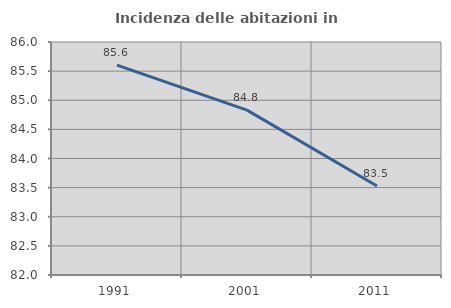
| Category | Incidenza delle abitazioni in proprietà  |
|---|---|
| 1991.0 | 85.604 |
| 2001.0 | 84.831 |
| 2011.0 | 83.528 |